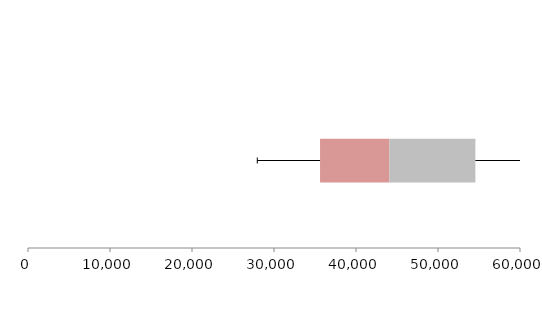
| Category | Series 1 | Series 2 | Series 3 |
|---|---|---|---|
| 0 | 35615.531 | 8461.539 | 10481.493 |